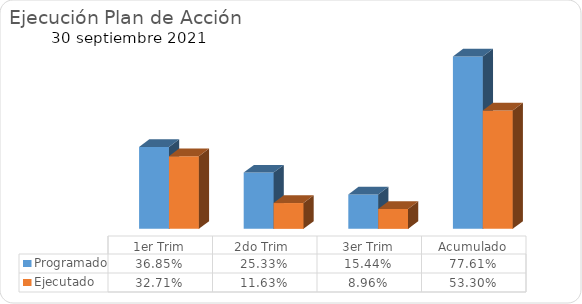
| Category | Programado | Ejecutado |
|---|---|---|
| 1er Trim | 0.368 | 0.327 |
| 2do Trim  | 0.253 | 0.116 |
| 3er Trim | 0.154 | 0.09 |
| Acumulado | 0.776 | 0.533 |